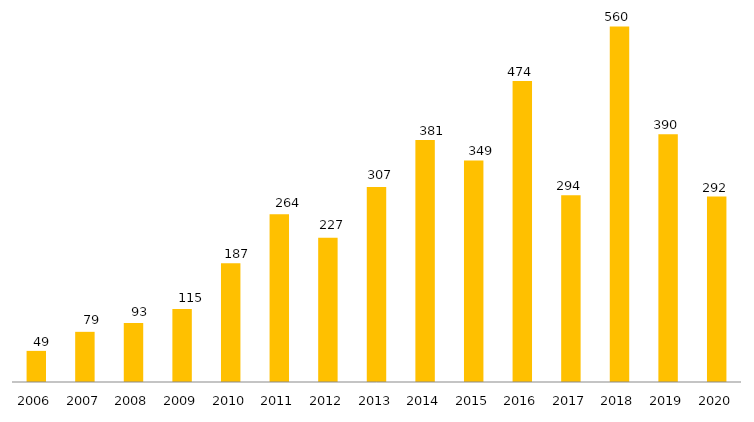
| Category | Pós - Graduação UFGD |
|---|---|
| 2006.0 | 49 |
| 2007.0 | 79 |
| 2008.0 | 93 |
| 2009.0 | 115 |
| 2010.0 | 187 |
| 2011.0 | 264 |
| 2012.0 | 227 |
| 2013.0 | 307 |
| 2014.0 | 381 |
| 2015.0 | 349 |
| 2016.0 | 474 |
| 2017.0 | 294 |
| 2018.0 | 560 |
| 2019.0 | 390 |
| 2020.0 | 292 |